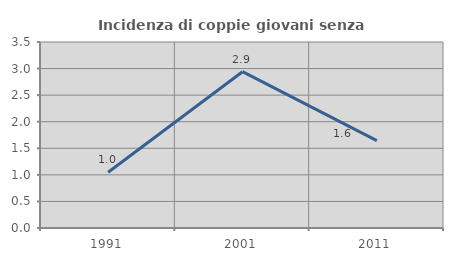
| Category | Incidenza di coppie giovani senza figli |
|---|---|
| 1991.0 | 1.049 |
| 2001.0 | 2.941 |
| 2011.0 | 1.645 |